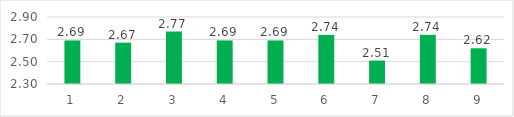
| Category | Series 0 |
|---|---|
| 0 | 2.69 |
| 1 | 2.67 |
| 2 | 2.77 |
| 3 | 2.69 |
| 4 | 2.69 |
| 5 | 2.74 |
| 6 | 2.51 |
| 7 | 2.74 |
| 8 | 2.62 |